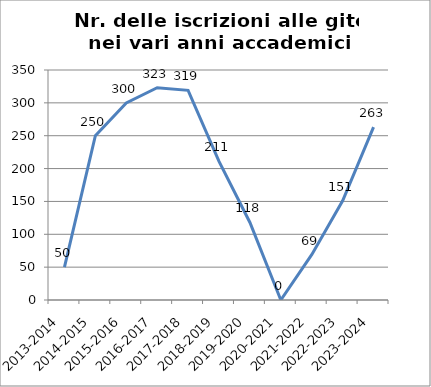
| Category | Nr. Iscrizioni alle Gite |
|---|---|
| 2013-2014 | 50 |
| 2014-2015 | 250 |
| 2015-2016 | 300 |
| 2016-2017 | 323 |
| 2017-2018 | 319 |
| 2018-2019 | 211 |
| 2019-2020 | 118 |
| 2020-2021 | 0 |
| 2021-2022 | 69 |
| 2022-2023 | 151 |
| 2023-2024 | 263 |